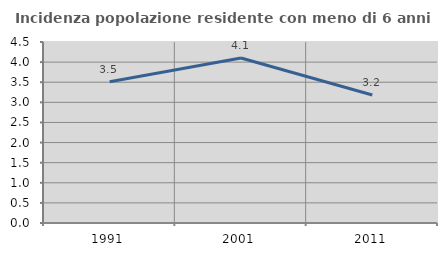
| Category | Incidenza popolazione residente con meno di 6 anni |
|---|---|
| 1991.0 | 3.512 |
| 2001.0 | 4.104 |
| 2011.0 | 3.182 |